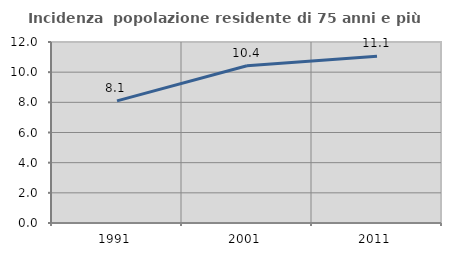
| Category | Incidenza  popolazione residente di 75 anni e più |
|---|---|
| 1991.0 | 8.099 |
| 2001.0 | 10.427 |
| 2011.0 | 11.058 |